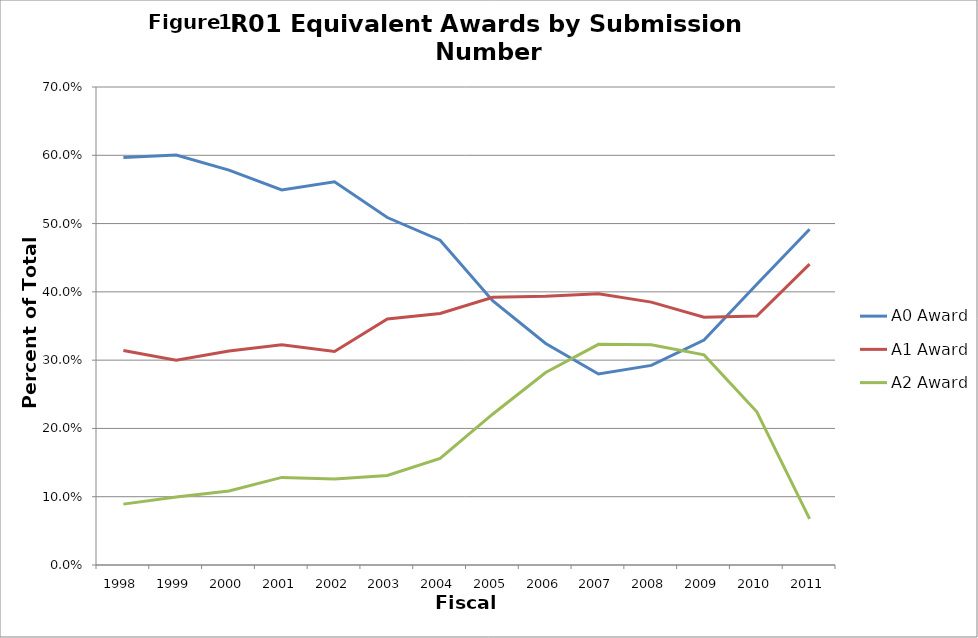
| Category | A0 Awards | A1 Awards | A2 Awards |
|---|---|---|---|
| 1998.0 | 0.597 | 0.314 | 0.089 |
| 1999.0 | 0.6 | 0.3 | 0.1 |
| 2000.0 | 0.578 | 0.313 | 0.108 |
| 2001.0 | 0.549 | 0.322 | 0.128 |
| 2002.0 | 0.561 | 0.313 | 0.126 |
| 2003.0 | 0.509 | 0.36 | 0.131 |
| 2004.0 | 0.476 | 0.368 | 0.156 |
| 2005.0 | 0.387 | 0.392 | 0.221 |
| 2006.0 | 0.324 | 0.394 | 0.282 |
| 2007.0 | 0.28 | 0.397 | 0.323 |
| 2008.0 | 0.292 | 0.385 | 0.323 |
| 2009.0 | 0.329 | 0.363 | 0.308 |
| 2010.0 | 0.411 | 0.365 | 0.224 |
| 2011.0 | 0.492 | 0.441 | 0.068 |